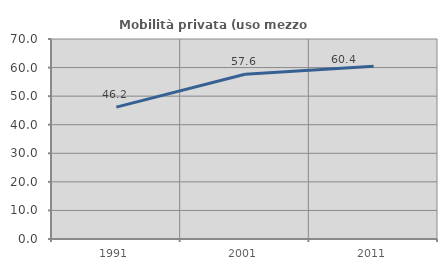
| Category | Mobilità privata (uso mezzo privato) |
|---|---|
| 1991.0 | 46.154 |
| 2001.0 | 57.647 |
| 2011.0 | 60.44 |